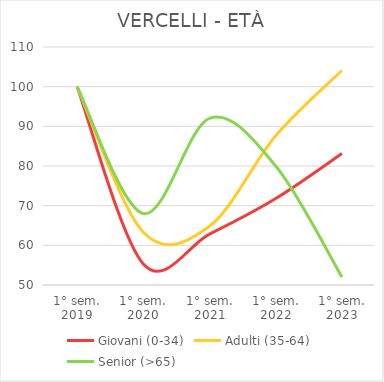
| Category | Giovani (0-34) | Adulti (35-64) | Senior (>65) |
|---|---|---|---|
| 1° sem.
2019 | 100 | 100 | 100 |
| 1° sem.
2020 | 55.309 | 63.293 | 68 |
| 1° sem.
2021 | 62.837 | 64.804 | 92 |
| 1° sem.
2022 | 71.791 | 87.613 | 80 |
| 1° sem.
2023 | 83.122 | 104.079 | 52 |